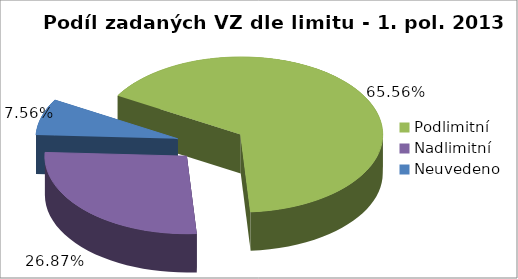
| Category | Series 0 |
|---|---|
| Podlimitní | 3796 |
| Nadlimitní | 1556 |
| Neuvedeno | 438 |